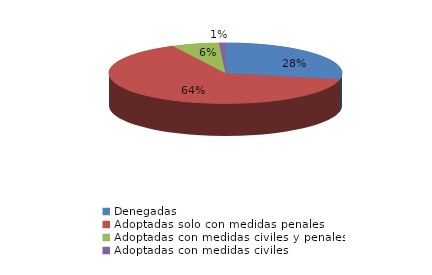
| Category | Series 0 |
|---|---|
| Denegadas | 187 |
| Adoptadas solo con medidas penales | 428 |
| Adoptadas con medidas civiles y penales | 43 |
| Adoptadas con medidas civiles | 6 |